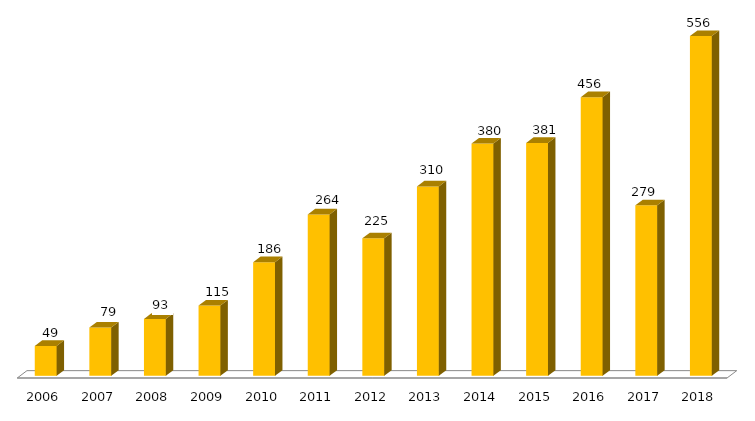
| Category | Pós - Graduação UFGD |
|---|---|
| 2006.0 | 49 |
| 2007.0 | 79 |
| 2008.0 | 93 |
| 2009.0 | 115 |
| 2010.0 | 186 |
| 2011.0 | 264 |
| 2012.0 | 225 |
| 2013.0 | 310 |
| 2014.0 | 380 |
| 2015.0 | 381 |
| 2016.0 | 456 |
| 2017.0 | 279 |
| 2018.0 | 556 |